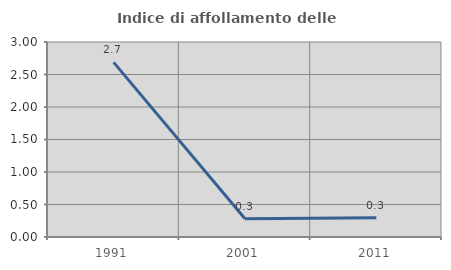
| Category | Indice di affollamento delle abitazioni  |
|---|---|
| 1991.0 | 2.687 |
| 2001.0 | 0.282 |
| 2011.0 | 0.297 |